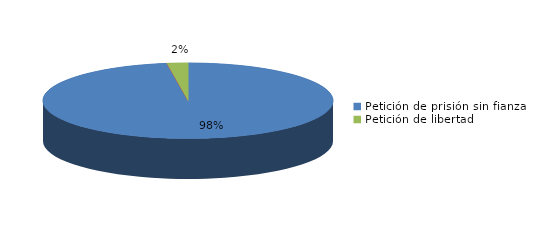
| Category | Series 0 |
|---|---|
| Petición de prisión sin fianza | 84 |
| Peticion de libertad con fianza | 0 |
| Petición de libertad | 2 |